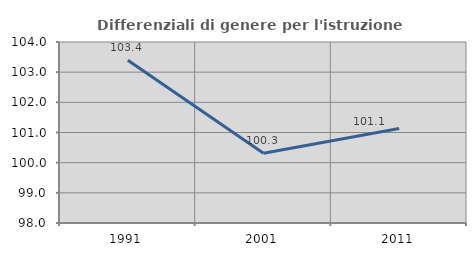
| Category | Differenziali di genere per l'istruzione superiore |
|---|---|
| 1991.0 | 103.394 |
| 2001.0 | 100.315 |
| 2011.0 | 101.13 |